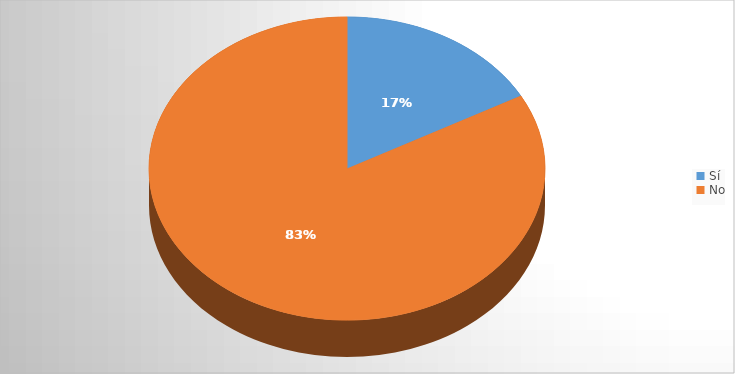
| Category | Series 0 |
|---|---|
| Sí | 16 |
| No | 78 |